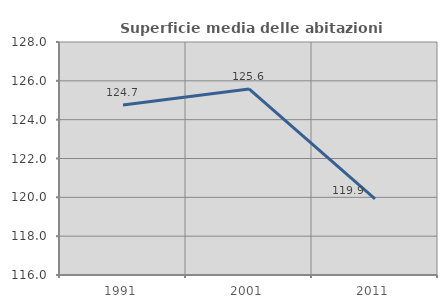
| Category | Superficie media delle abitazioni occupate |
|---|---|
| 1991.0 | 124.75 |
| 2001.0 | 125.58 |
| 2011.0 | 119.925 |